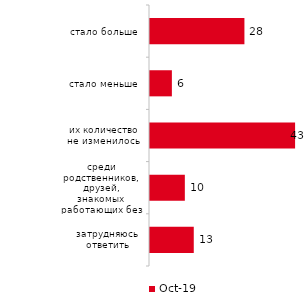
| Category | окт.19 |
|---|---|
| стало больше | 27.772 |
| стало меньше | 6.436 |
| их количество не изменилось | 42.673 |
| среди родственников, друзей, знакомых работающих без официального оформления нет | 10.248 |
| затрудняюсь ответить | 12.871 |